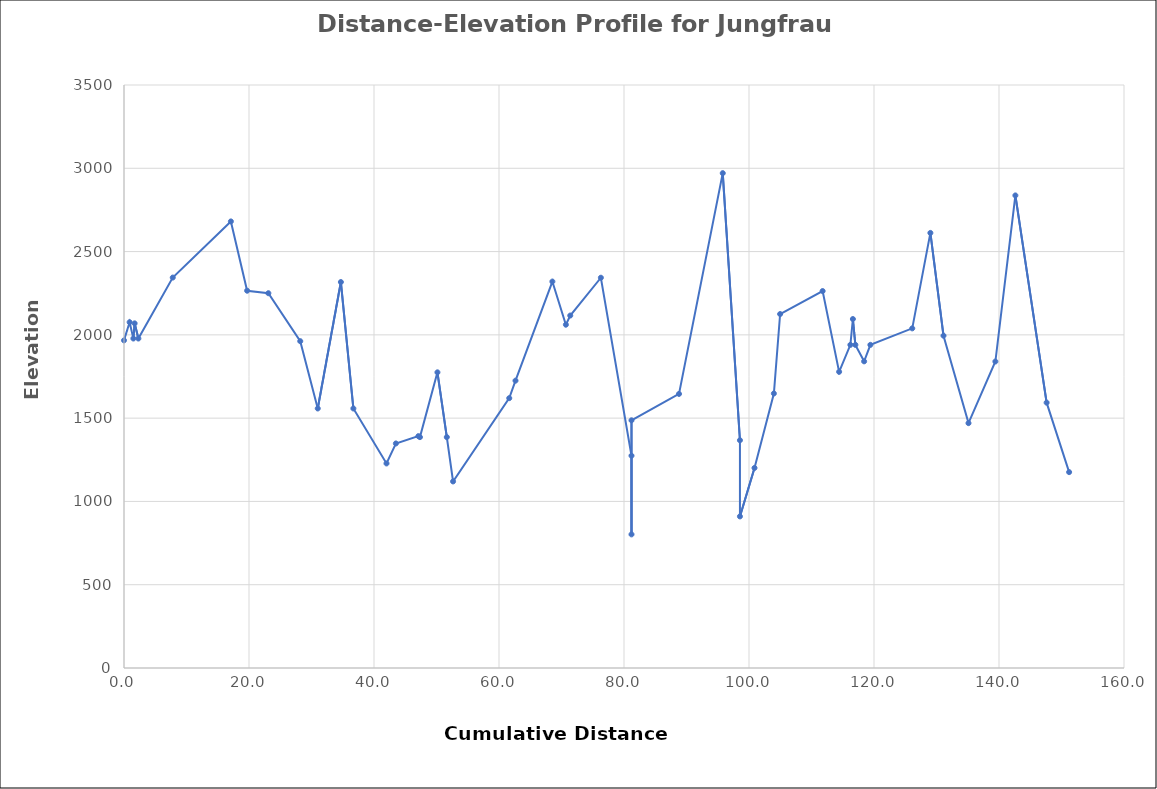
| Category | Series 0 |
|---|---|
| 0.0 | 1967 |
| 0.9 | 2076 |
| 1.5 | 1978 |
| 1.7 | 2069 |
| 2.3 | 1978 |
| 7.8 | 2344 |
| 17.1 | 2681 |
| 19.700000000000003 | 2265 |
| 23.1 | 2250 |
| 28.200000000000003 | 1962 |
| 31.000000000000004 | 1558 |
| 34.7 | 2317 |
| 36.7 | 1558 |
| 42.0 | 1228 |
| 43.5 | 1348 |
| 47.1 | 1392 |
| 47.35 | 1386 |
| 50.15 | 1775 |
| 51.65 | 1386 |
| 52.65 | 1120 |
| 61.64 | 1620 |
| 62.64 | 1725 |
| 68.54 | 2320 |
| 70.7 | 2061 |
| 71.4 | 2116 |
| 76.30000000000001 | 2343 |
| 81.20000000000002 | 1274.39 |
| 81.20000000000002 | 802.134 |
| 81.20000000000002 | 1487 |
| 88.80000000000001 | 1645.427 |
| 95.80000000000001 | 2970.732 |
| 98.55000000000001 | 1367.378 |
| 98.55000000000001 | 910 |
| 100.88000000000001 | 1201 |
| 103.98 | 1648 |
| 104.98 | 2125 |
| 111.78 | 2263 |
| 114.42 | 1778 |
| 116.22 | 1940 |
| 116.62 | 2095 |
| 117.02000000000001 | 1940 |
| 118.42000000000002 | 1841 |
| 119.42000000000002 | 1940 |
| 126.12000000000002 | 2039 |
| 129.02 | 2612 |
| 131.12 | 1995 |
| 135.12 | 1470 |
| 139.42000000000002 | 1840 |
| 142.62 | 2837 |
| 147.62 | 1593 |
| 151.22 | 1176 |